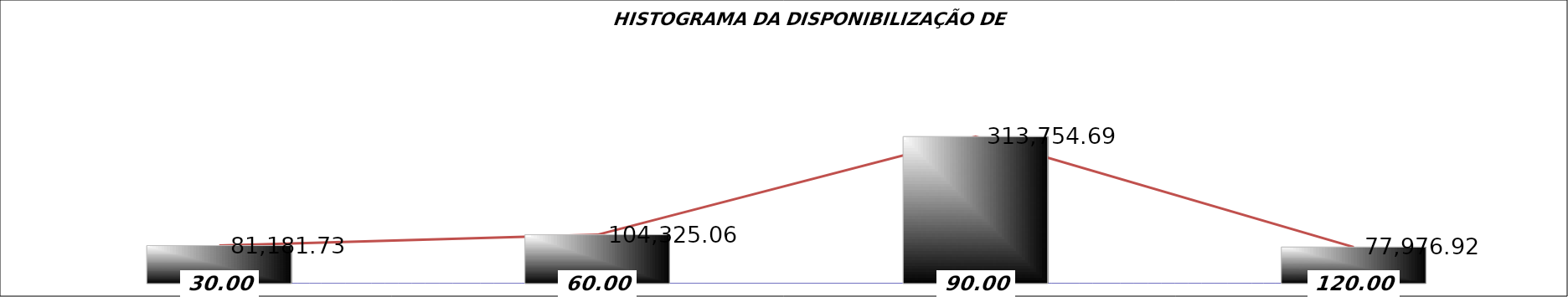
| Category | Series 0 | Series 1 |
|---|---|---|
| 0 | 30 | 81181.729 |
| 1 | 60 | 104325.059 |
| 2 | 90 | 313754.69 |
| 3 | 120 | 77976.916 |